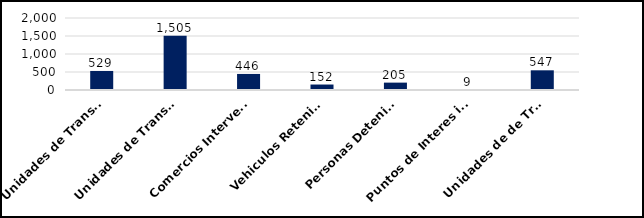
| Category | Series 0 |
|---|---|
| Unidades de Transporte de Combustibles Inspeccionados | 529 |
| Unidades de Transporte de Mercancias Inspeccionadas | 1505 |
| Comercios Intervenidos | 446 |
| Vehiculos Retenidos  | 152 |
| Personas Detenidas | 205 |
| Puntos de Interes intervenidos | 9 |
| Unidades de de Transporte Desechos Oleosos Inspeccionadas  | 547 |